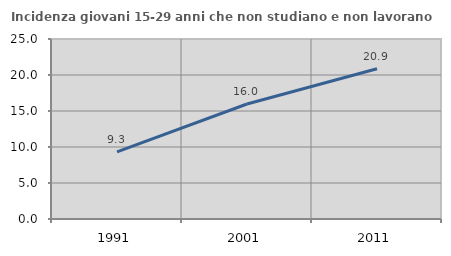
| Category | Incidenza giovani 15-29 anni che non studiano e non lavorano  |
|---|---|
| 1991.0 | 9.335 |
| 2001.0 | 15.974 |
| 2011.0 | 20.861 |